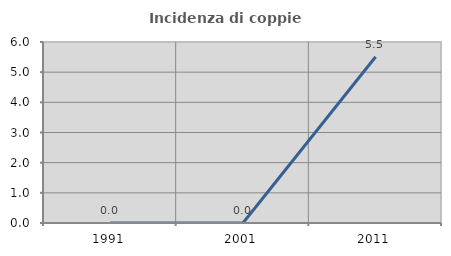
| Category | Incidenza di coppie miste |
|---|---|
| 1991.0 | 0 |
| 2001.0 | 0 |
| 2011.0 | 5.512 |